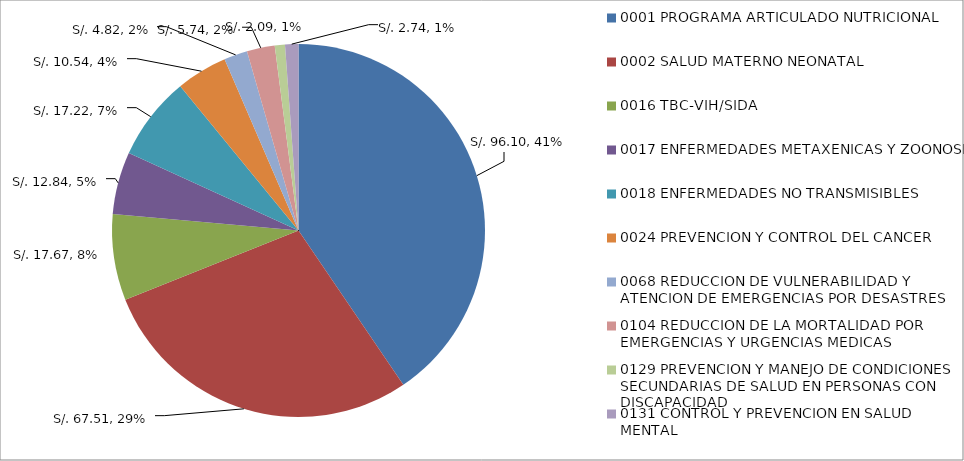
| Category | Series 0 |
|---|---|
| 0001 PROGRAMA ARTICULADO NUTRICIONAL | 96.1 |
| 0002 SALUD MATERNO NEONATAL | 67.507 |
| 0016 TBC-VIH/SIDA | 17.668 |
| 0017 ENFERMEDADES METAXENICAS Y ZOONOSIS | 12.844 |
| 0018 ENFERMEDADES NO TRANSMISIBLES | 17.22 |
| 0024 PREVENCION Y CONTROL DEL CANCER | 10.541 |
| 0068 REDUCCION DE VULNERABILIDAD Y ATENCION DE EMERGENCIAS POR DESASTRES | 4.818 |
| 0104 REDUCCION DE LA MORTALIDAD POR EMERGENCIAS Y URGENCIAS MEDICAS | 5.735 |
| 0129 PREVENCION Y MANEJO DE CONDICIONES SECUNDARIAS DE SALUD EN PERSONAS CON DISCAPACIDAD | 2.092 |
| 0131 CONTROL Y PREVENCION EN SALUD MENTAL | 2.742 |